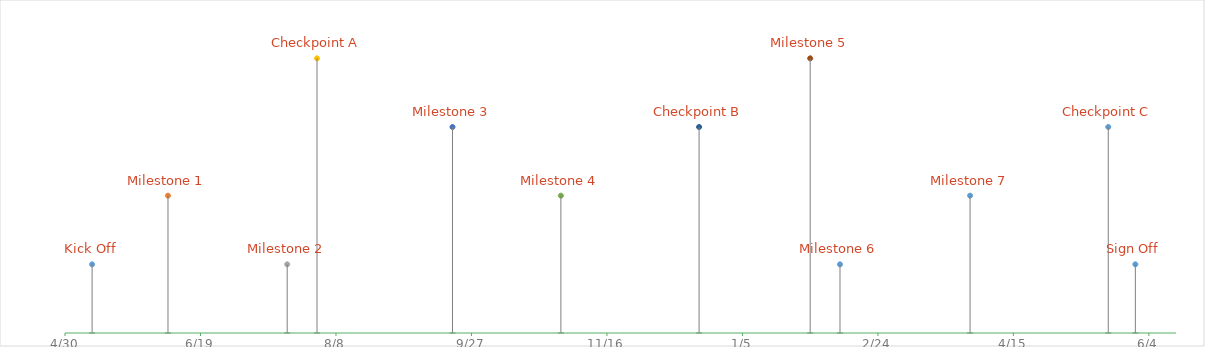
| Category | Series 0 |
|---|---|
| 42500.0 | 1 |
| 42528.0 | 2 |
| 42572.0 | 1 |
| 42583.0 | 4 |
| 42633.0 | 3 |
| 42673.0 | 2 |
| 42724.0 | 3 |
| 42765.0 | 4 |
| 42776.0 | 1 |
| 42824.0 | 2 |
| 42875.0 | 3 |
| 42885.0 | 1 |